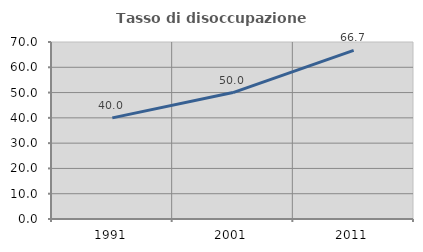
| Category | Tasso di disoccupazione giovanile  |
|---|---|
| 1991.0 | 40 |
| 2001.0 | 50 |
| 2011.0 | 66.667 |